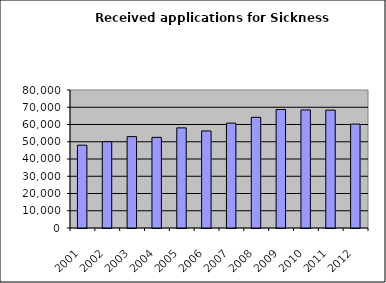
| Category | Series 1 |
|---|---|
| 2001.0 | 48010 |
| 2002.0 | 49998 |
| 2003.0 | 52964 |
| 2004.0 | 52551 |
| 2005.0 | 58046 |
| 2006.0 | 56263 |
| 2007.0 | 60792 |
| 2008.0 | 64163 |
| 2009.0 | 68694 |
| 2010.0 | 68418 |
| 2011.0 | 68310 |
| 2012.0 | 60239 |